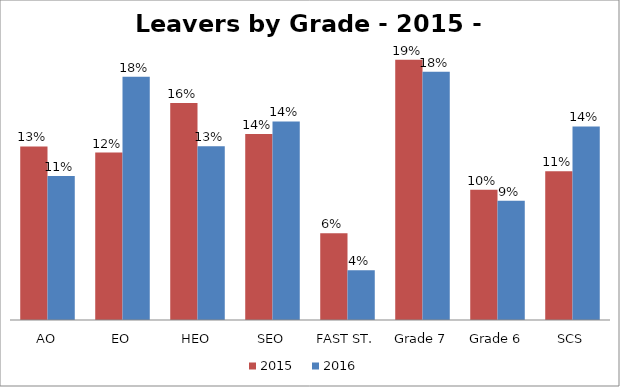
| Category | 2015
 | 2016
 |
|---|---|---|
| AO | 0.127 | 0.105 |
| EO | 0.122 | 0.178 |
| HEO | 0.158 | 0.127 |
| SEO | 0.136 | 0.145 |
| FAST ST. | 0.063 | 0.036 |
| Grade 7 | 0.19 | 0.181 |
| Grade 6 | 0.095 | 0.087 |
| SCS | 0.109 | 0.141 |